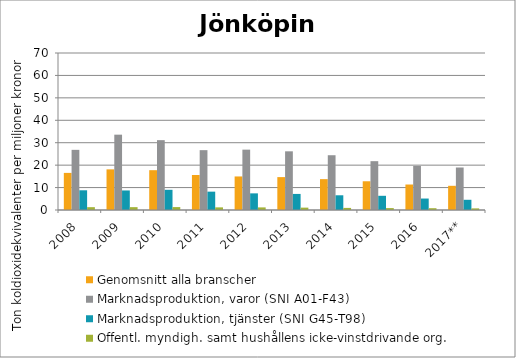
| Category | Genomsnitt alla branscher | Marknadsproduktion, varor (SNI A01-F43) | Marknadsproduktion, tjänster (SNI G45-T98) | Offentl. myndigh. samt hushållens icke-vinstdrivande org. |
|---|---|---|---|---|
| 2008 | 16.544 | 26.818 | 8.791 | 1.262 |
| 2009 | 18.117 | 33.587 | 8.716 | 1.27 |
| 2010 | 17.752 | 31.139 | 9.002 | 1.298 |
| 2011 | 15.596 | 26.683 | 8.179 | 1.176 |
| 2012 | 14.957 | 26.908 | 7.417 | 1.16 |
| 2013 | 14.665 | 26.162 | 7.166 | 1.058 |
| 2014 | 13.762 | 24.421 | 6.562 | 0.935 |
| 2015 | 12.809 | 21.771 | 6.331 | 0.853 |
| 2016 | 11.362 | 19.665 | 5.111 | 0.802 |
| 2017** | 10.786 | 18.95 | 4.553 | 0.723 |